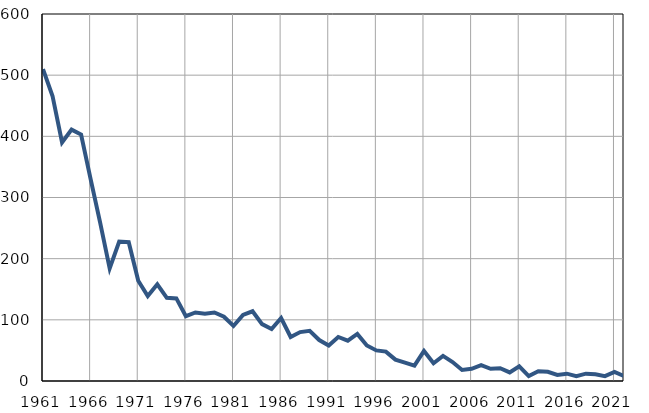
| Category | Infants
deaths |
|---|---|
| 1961.0 | 510 |
| 1962.0 | 466 |
| 1963.0 | 390 |
| 1964.0 | 411 |
| 1965.0 | 403 |
| 1966.0 | 330 |
| 1967.0 | 259 |
| 1968.0 | 184 |
| 1969.0 | 228 |
| 1970.0 | 227 |
| 1971.0 | 164 |
| 1972.0 | 139 |
| 1973.0 | 158 |
| 1974.0 | 136 |
| 1975.0 | 135 |
| 1976.0 | 106 |
| 1977.0 | 112 |
| 1978.0 | 110 |
| 1979.0 | 112 |
| 1980.0 | 105 |
| 1981.0 | 90 |
| 1982.0 | 108 |
| 1983.0 | 114 |
| 1984.0 | 93 |
| 1985.0 | 85 |
| 1986.0 | 103 |
| 1987.0 | 72 |
| 1988.0 | 80 |
| 1989.0 | 82 |
| 1990.0 | 67 |
| 1991.0 | 58 |
| 1992.0 | 72 |
| 1993.0 | 66 |
| 1994.0 | 77 |
| 1995.0 | 58 |
| 1996.0 | 50 |
| 1997.0 | 48 |
| 1998.0 | 35 |
| 1999.0 | 30 |
| 2000.0 | 25 |
| 2001.0 | 49 |
| 2002.0 | 29 |
| 2003.0 | 41 |
| 2004.0 | 31 |
| 2005.0 | 18 |
| 2006.0 | 20 |
| 2007.0 | 26 |
| 2008.0 | 20 |
| 2009.0 | 21 |
| 2010.0 | 14 |
| 2011.0 | 24 |
| 2012.0 | 8 |
| 2013.0 | 16 |
| 2014.0 | 15 |
| 2015.0 | 10 |
| 2016.0 | 12 |
| 2017.0 | 8 |
| 2018.0 | 12 |
| 2019.0 | 11 |
| 2020.0 | 8 |
| 2021.0 | 15 |
| 2022.0 | 8 |